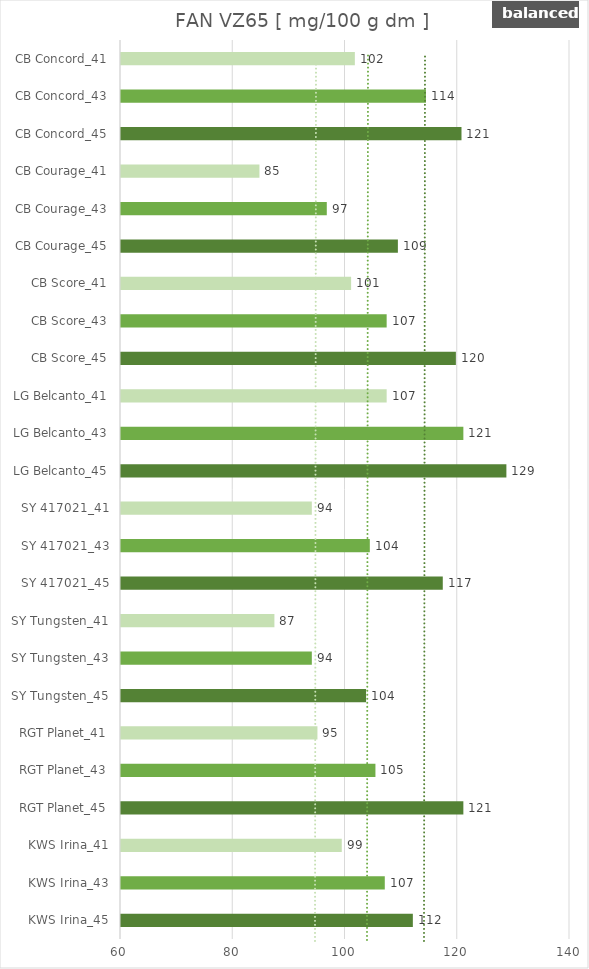
| Category |    FAN VZ65 [ mg/100 g dm ] |
|---|---|
| KWS Irina_45 | 112 |
| KWS Irina_43 | 107 |
| KWS Irina_41 | 99.333 |
| RGT Planet_45 | 121 |
| RGT Planet_43 | 105.333 |
| RGT Planet_41 | 95 |
| SY Tungsten_45 | 103.667 |
| SY Tungsten_43 | 94 |
| SY Tungsten_41 | 87.333 |
| SY 417021_45 | 117.333 |
| SY 417021_43 | 104.333 |
| SY 417021_41 | 94 |
| LG Belcanto_45 | 128.667 |
| LG Belcanto_43 | 121 |
| LG Belcanto_41 | 107.333 |
| CB Score_45 | 119.667 |
| CB Score_43 | 107.333 |
| CB Score_41 | 101 |
| CB Courage_45 | 109.333 |
| CB Courage_43 | 96.667 |
| CB Courage_41 | 84.667 |
| CB Concord_45 | 120.667 |
| CB Concord_43 | 114.333 |
| CB Concord_41 | 101.667 |